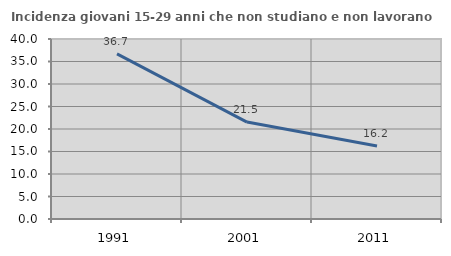
| Category | Incidenza giovani 15-29 anni che non studiano e non lavorano  |
|---|---|
| 1991.0 | 36.709 |
| 2001.0 | 21.538 |
| 2011.0 | 16.216 |